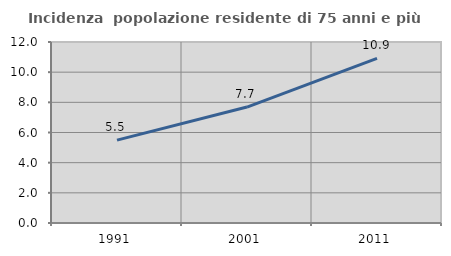
| Category | Incidenza  popolazione residente di 75 anni e più |
|---|---|
| 1991.0 | 5.495 |
| 2001.0 | 7.688 |
| 2011.0 | 10.91 |